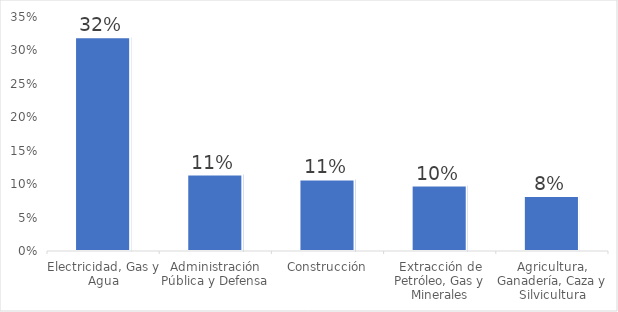
| Category | Series 0 |
|---|---|
| Electricidad, Gas y Agua | 0.32 |
| Administración Pública y Defensa | 0.114 |
| Construcción | 0.107 |
| Extracción de Petróleo, Gas y Minerales | 0.098 |
| Agricultura, Ganadería, Caza y Silvicultura | 0.082 |